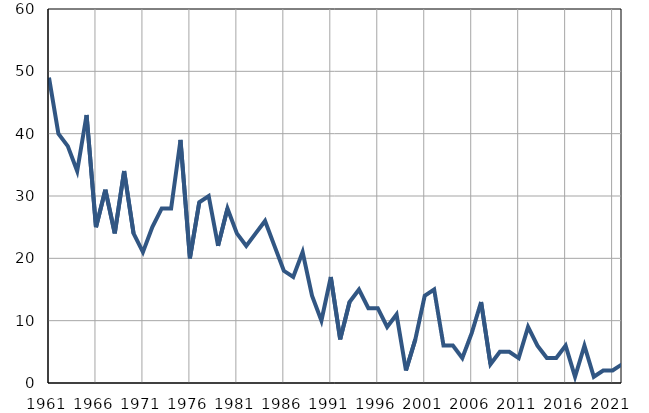
| Category | Умрла 
одојчад |
|---|---|
| 1961.0 | 49 |
| 1962.0 | 40 |
| 1963.0 | 38 |
| 1964.0 | 34 |
| 1965.0 | 43 |
| 1966.0 | 25 |
| 1967.0 | 31 |
| 1968.0 | 24 |
| 1969.0 | 34 |
| 1970.0 | 24 |
| 1971.0 | 21 |
| 1972.0 | 25 |
| 1973.0 | 28 |
| 1974.0 | 28 |
| 1975.0 | 39 |
| 1976.0 | 20 |
| 1977.0 | 29 |
| 1978.0 | 30 |
| 1979.0 | 22 |
| 1980.0 | 28 |
| 1981.0 | 24 |
| 1982.0 | 22 |
| 1983.0 | 24 |
| 1984.0 | 26 |
| 1985.0 | 22 |
| 1986.0 | 18 |
| 1987.0 | 17 |
| 1988.0 | 21 |
| 1989.0 | 14 |
| 1990.0 | 10 |
| 1991.0 | 17 |
| 1992.0 | 7 |
| 1993.0 | 13 |
| 1994.0 | 15 |
| 1995.0 | 12 |
| 1996.0 | 12 |
| 1997.0 | 9 |
| 1998.0 | 11 |
| 1999.0 | 2 |
| 2000.0 | 7 |
| 2001.0 | 14 |
| 2002.0 | 15 |
| 2003.0 | 6 |
| 2004.0 | 6 |
| 2005.0 | 4 |
| 2006.0 | 8 |
| 2007.0 | 13 |
| 2008.0 | 3 |
| 2009.0 | 5 |
| 2010.0 | 5 |
| 2011.0 | 4 |
| 2012.0 | 9 |
| 2013.0 | 6 |
| 2014.0 | 4 |
| 2015.0 | 4 |
| 2016.0 | 6 |
| 2017.0 | 1 |
| 2018.0 | 6 |
| 2019.0 | 1 |
| 2020.0 | 2 |
| 2021.0 | 2 |
| 2022.0 | 3 |